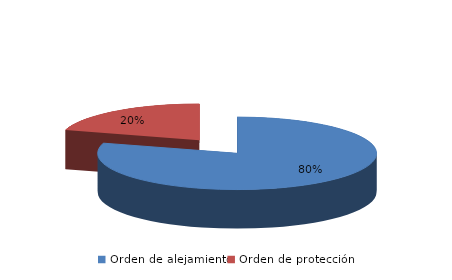
| Category | Series 0 |
|---|---|
| Orden de alejamiento | 132 |
| Orden de protección | 34 |